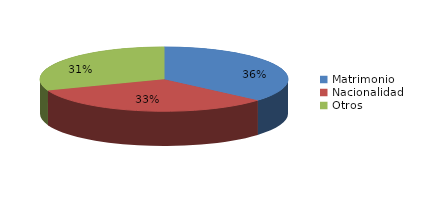
| Category | Series 0 |
|---|---|
| Matrimonio | 883 |
| Nacionalidad | 798 |
| Otros | 746 |